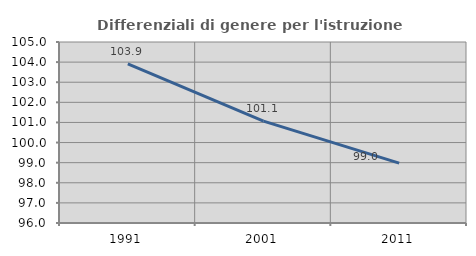
| Category | Differenziali di genere per l'istruzione superiore |
|---|---|
| 1991.0 | 103.913 |
| 2001.0 | 101.064 |
| 2011.0 | 98.975 |